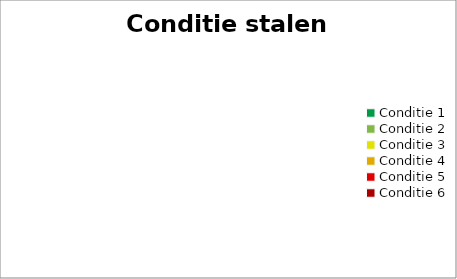
| Category | Conditie stalen balken |
|---|---|
| Conditie 1 | 0 |
| Conditie 2 | 0 |
| Conditie 3 | 0 |
| Conditie 4 | 0 |
| Conditie 5 | 0 |
| Conditie 6 | 0 |